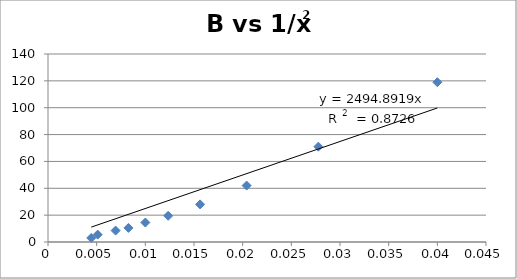
| Category | B |
|---|---|
| 0.04 | 119 |
| 0.027777777777777776 | 71 |
| 0.02040816326530612 | 42 |
| 0.015625 | 28 |
| 0.012345679012345678 | 19.5 |
| 0.01 | 14.5 |
| 0.008264462809917356 | 10.5 |
| 0.006944444444444444 | 8.5 |
| 0.00510204081632653 | 5.5 |
| 0.0044444444444444444 | 3 |